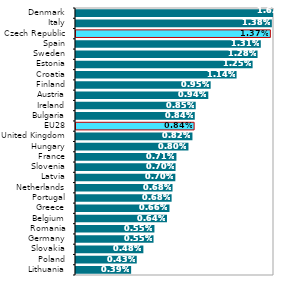
| Category |  Celkem 
(ISCO 35) |
|---|---|
| Lithuania | 0.004 |
| Poland | 0.004 |
| Slovakia | 0.005 |
| Germany | 0.005 |
| Romania | 0.006 |
| Belgium | 0.006 |
| Greece | 0.007 |
| Portugal | 0.007 |
| Netherlands | 0.007 |
| Latvia | 0.007 |
| Slovenia | 0.007 |
| France | 0.007 |
| Hungary | 0.008 |
| United Kingdom | 0.008 |
| EU28 | 0.008 |
| Bulgaria | 0.008 |
| Ireland | 0.008 |
| Austria | 0.009 |
| Finland | 0.01 |
| Croatia | 0.011 |
| Estonia | 0.012 |
| Sweden | 0.013 |
| Spain | 0.013 |
| Czech Republic | 0.014 |
| Italy | 0.014 |
| Denmark | 0.016 |